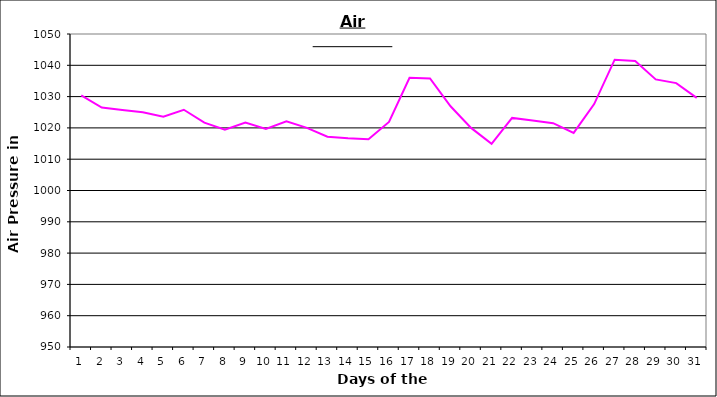
| Category | Series 0 |
|---|---|
| 0 | 1030.4 |
| 1 | 1026.5 |
| 2 | 1025.7 |
| 3 | 1025 |
| 4 | 1023.6 |
| 5 | 1025.8 |
| 6 | 1021.7 |
| 7 | 1019.4 |
| 8 | 1021.7 |
| 9 | 1019.7 |
| 10 | 1022.1 |
| 11 | 1020 |
| 12 | 1017.2 |
| 13 | 1016.7 |
| 14 | 1016.4 |
| 15 | 1021.9 |
| 16 | 1036 |
| 17 | 1035.8 |
| 18 | 1026.9 |
| 19 | 1020 |
| 20 | 1014.9 |
| 21 | 1023.2 |
| 22 | 1022.4 |
| 23 | 1021.5 |
| 24 | 1018.4 |
| 25 | 1027.6 |
| 26 | 1041.8 |
| 27 | 1041.4 |
| 28 | 1035.5 |
| 29 | 1034.3 |
| 30 | 1029.6 |